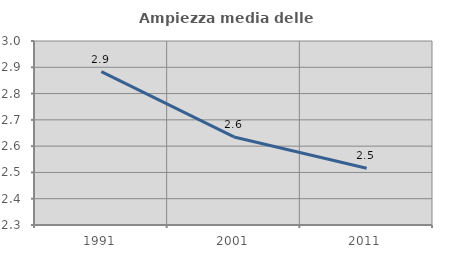
| Category | Ampiezza media delle famiglie |
|---|---|
| 1991.0 | 2.884 |
| 2001.0 | 2.635 |
| 2011.0 | 2.516 |